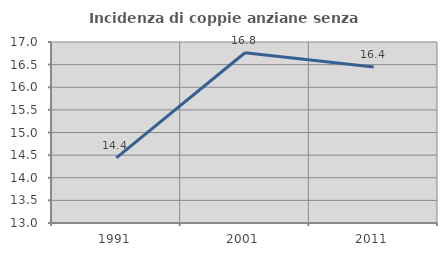
| Category | Incidenza di coppie anziane senza figli  |
|---|---|
| 1991.0 | 14.439 |
| 2001.0 | 16.763 |
| 2011.0 | 16.447 |